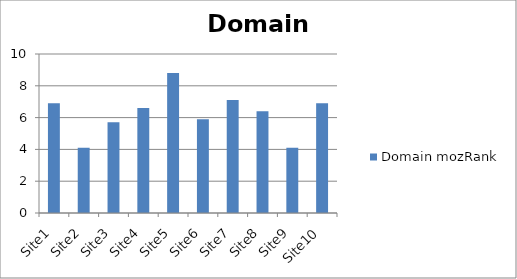
| Category | Domain mozRank |
|---|---|
| Site1 | 6.9 |
| Site2 | 4.1 |
| Site3 | 5.7 |
| Site4 | 6.6 |
| Site5 | 8.8 |
| Site6 | 5.9 |
| Site7 | 7.1 |
| Site8 | 6.4 |
| Site9 | 4.1 |
| Site10 | 6.9 |